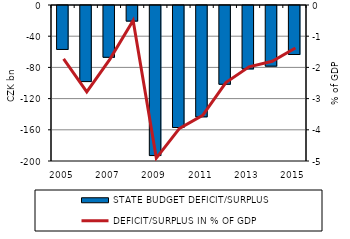
| Category | STATE BUDGET DEFICIT/SURPLUS |
|---|---|
| 2005.0 | -56.338 |
| 2006.0 | -97.58 |
| 2007.0 | -66.392 |
| 2008.0 | -20.003 |
| 2009.0 | -192.394 |
| 2010.0 | -156.416 |
| 2011.0 | -142.771 |
| 2012.0 | -101 |
| 2013.0 | -81.264 |
| 2014.0 | -77.782 |
| 2015.0 | -62.804 |